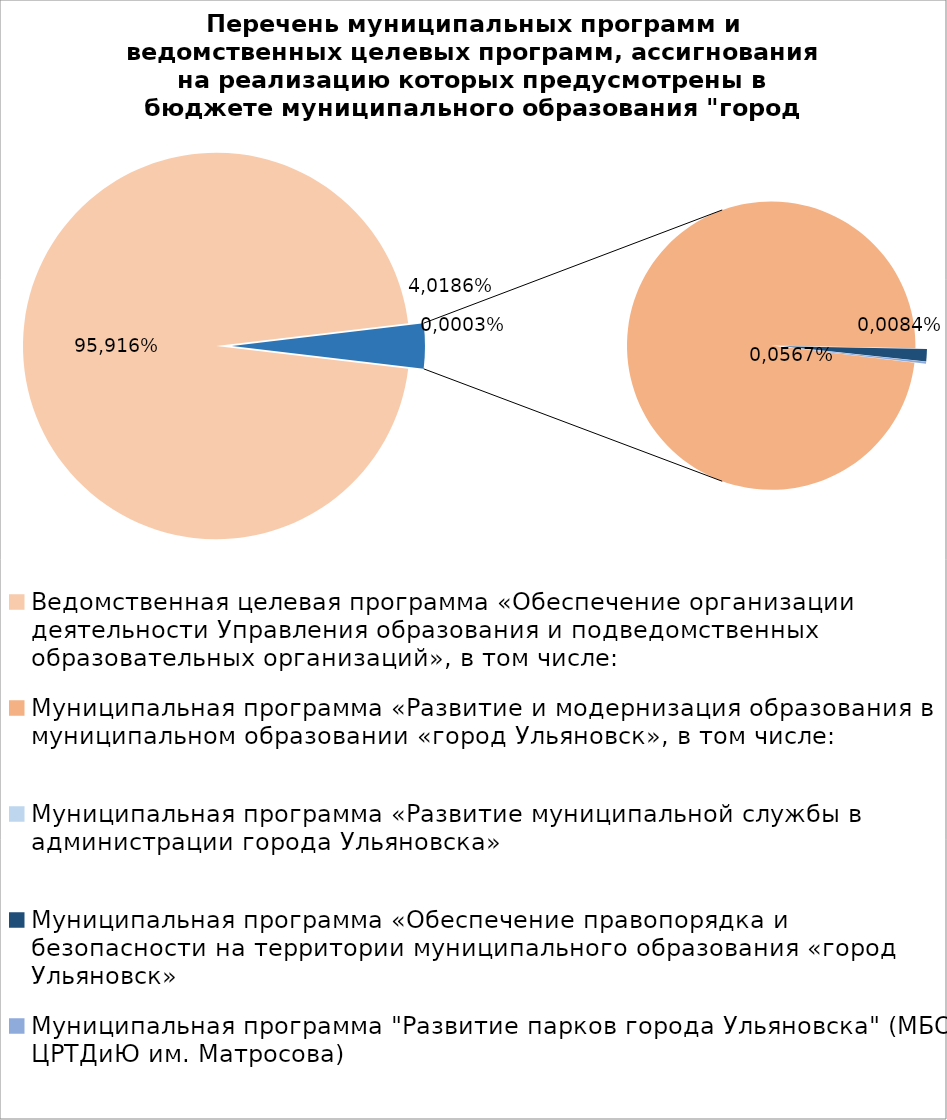
| Category | Series 0 |
|---|---|
| Ведомственная целевая программа «Обеспечение организации деятельности Управления образования и подведомственных образовательных организаций», в том числе: | 4974764.74 |
| Муниципальная программа «Развитие и модернизация образования в муниципальном образовании «город Ульяновск», в том числе: | 191725.5 |
| Муниципальная программа «Развитие муниципальной службы в администрации города Ульяновска» | 15.4 |
| Муниципальная программа «Обеспечение правопорядка и безопасности на территории муниципального образования «город Ульяновск» | 2700 |
| Муниципальная программа "Развитие парков города Ульяновска" (МБОУ ЦРТДиЮ им. Матросова) | 400 |